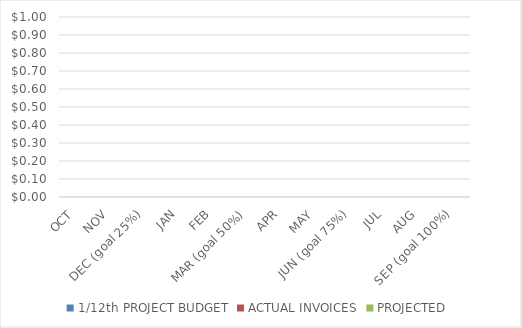
| Category | 1/12th PROJECT BUDGET | ACTUAL INVOICES | PROJECTED  |
|---|---|---|---|
| OCT | 0 |  |  |
| NOV | 0 |  |  |
| DEC (goal 25%) | 0 |  |  |
| JAN | 0 |  |  |
| FEB | 0 |  |  |
| MAR (goal 50%) | 0 |  |  |
| APR | 0 |  |  |
| MAY | 0 |  |  |
| JUN (goal 75%) | 0 |  |  |
| JUL | 0 |  |  |
| AUG | 0 |  |  |
| SEP (goal 100%) | 0 |  |  |